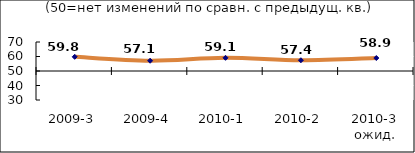
| Category | Диф.индекс ↓ |
|---|---|
| 2009-3 | 59.79 |
| 2009-4 | 57.085 |
| 2010-1 | 59.075 |
| 2010-2 | 57.41 |
| 2010-3 ожид. | 58.935 |